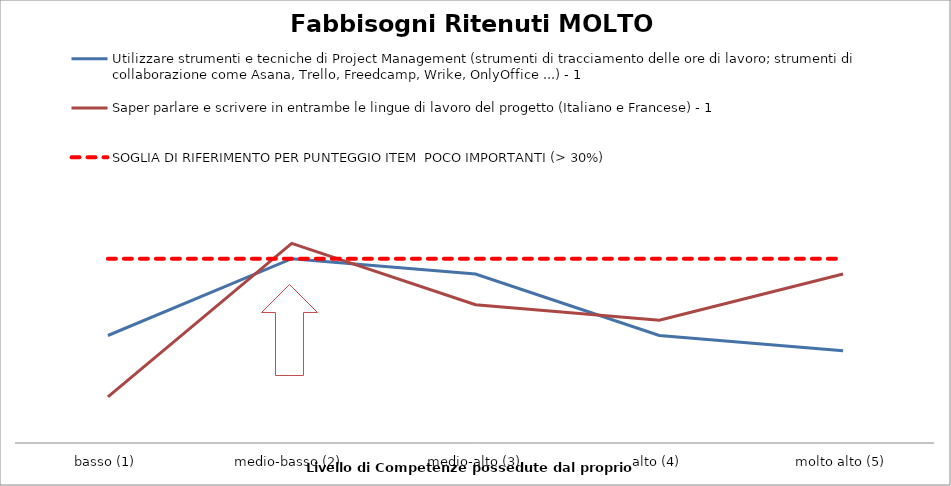
| Category | Utilizzare strumenti e tecniche di Project Management (strumenti di tracciamento delle ore di lavoro; strumenti di collaborazione come Asana, Trello, Freedcamp, Wrike, OnlyOffice ...) - 1 | Saper parlare e scrivere in entrambe le lingue di lavoro del progetto (Italiano e Francese) - 1 | SOGLIA DI RIFERIMENTO PER PUNTEGGIO ITEM  POCO IMPORTANTI (> 30%) |
|---|---|---|---|
| basso (1) | 7 | 3 | 12 |
| medio-basso (2) | 12 | 13 | 12 |
|  medio-alto (3) | 11 | 9 | 12 |
| alto (4) | 7 | 8 | 12 |
| molto alto (5) | 6 | 11 | 12 |